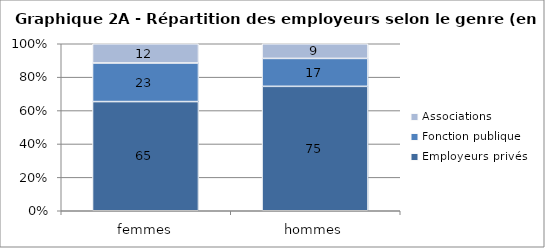
| Category | Employeurs privés | Fonction publique | Associations |
|---|---|---|---|
| femmes | 65.38 | 23.11 | 11.51 |
| hommes | 74.5 | 16.72 | 8.78 |